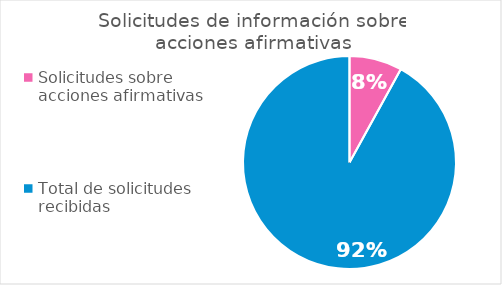
| Category | Series 0 |
|---|---|
| Solicitudes sobre acciones afirmativas | 4 |
| Total de solicitudes recibidas | 46 |